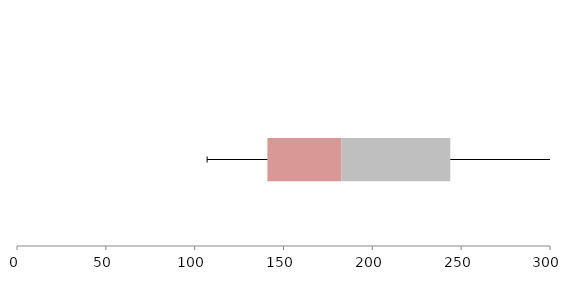
| Category | Series 1 | Series 2 | Series 3 |
|---|---|---|---|
| 0 | 140.94 | 41.707 | 61.21 |